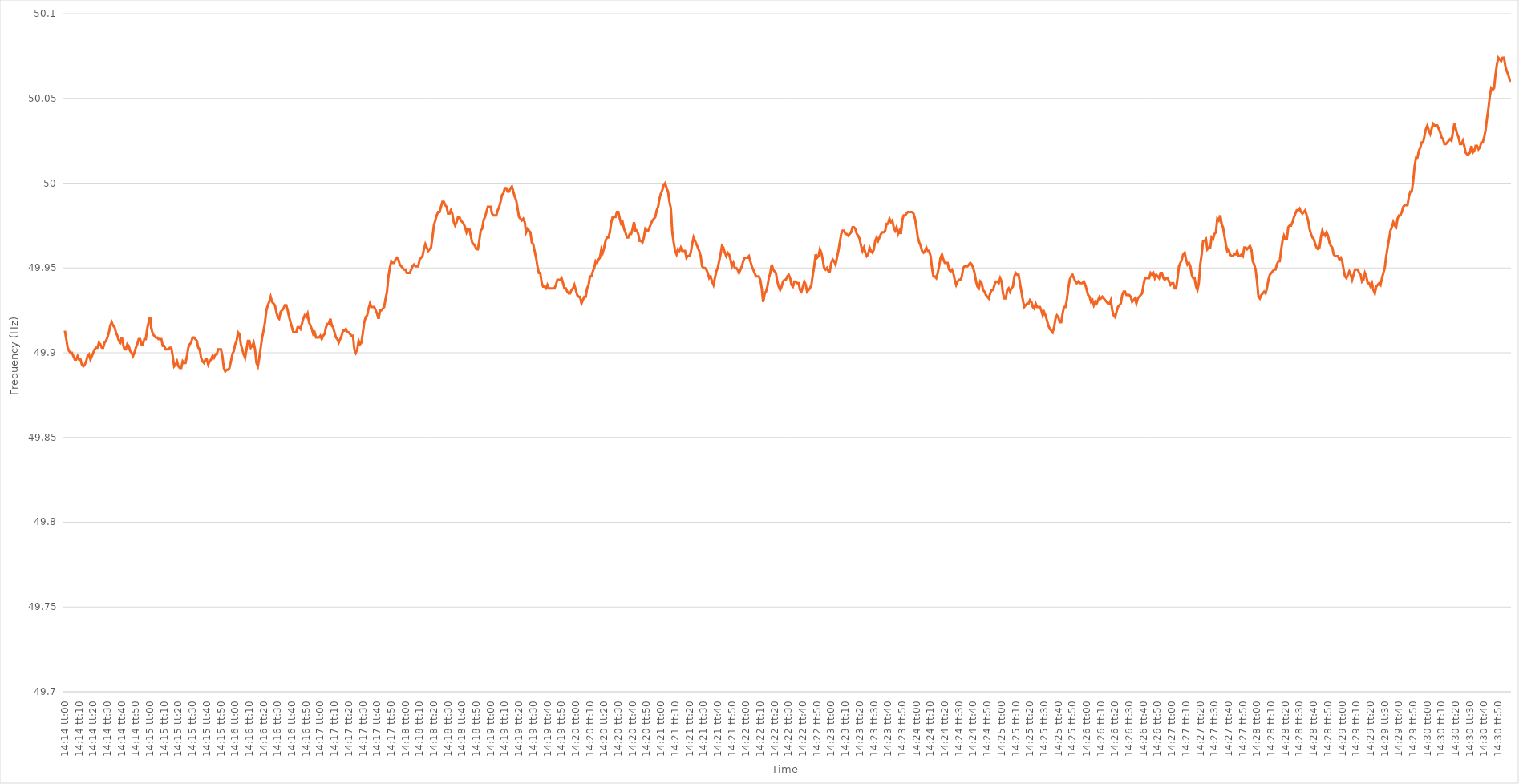
| Category | Series 0 |
|---|---|
| 0.5930555555555556 | 49.913 |
| 0.5930671296296296 | 49.908 |
| 0.5930787037037036 | 49.903 |
| 0.5930902777777778 | 49.901 |
| 0.5931018518518518 | 49.9 |
| 0.593113425925926 | 49.9 |
| 0.593125 | 49.898 |
| 0.593136574074074 | 49.896 |
| 0.5931481481481481 | 49.896 |
| 0.5931597222222222 | 49.898 |
| 0.5931712962962963 | 49.896 |
| 0.5931828703703704 | 49.896 |
| 0.5931944444444445 | 49.893 |
| 0.5932060185185185 | 49.892 |
| 0.5932175925925925 | 49.893 |
| 0.5932291666666667 | 49.895 |
| 0.5932407407407407 | 49.898 |
| 0.5932523148148149 | 49.899 |
| 0.5932638888888889 | 49.896 |
| 0.593275462962963 | 49.898 |
| 0.593287037037037 | 49.9 |
| 0.593298611111111 | 49.902 |
| 0.5933101851851852 | 49.903 |
| 0.5933217592592592 | 49.903 |
| 0.5933333333333334 | 49.906 |
| 0.5933449074074074 | 49.905 |
| 0.5933564814814815 | 49.903 |
| 0.5933680555555555 | 49.903 |
| 0.5933796296296296 | 49.906 |
| 0.5933912037037037 | 49.907 |
| 0.5934027777777778 | 49.909 |
| 0.5934143518518519 | 49.912 |
| 0.5934259259259259 | 49.916 |
| 0.5934375 | 49.918 |
| 0.5934490740740741 | 49.916 |
| 0.5934606481481481 | 49.915 |
| 0.5934722222222223 | 49.912 |
| 0.5934837962962963 | 49.91 |
| 0.5934953703703704 | 49.907 |
| 0.5935069444444444 | 49.906 |
| 0.5935185185185184 | 49.909 |
| 0.5935300925925926 | 49.905 |
| 0.5935416666666666 | 49.902 |
| 0.5935532407407408 | 49.902 |
| 0.5935648148148148 | 49.905 |
| 0.5935763888888889 | 49.904 |
| 0.5935879629629629 | 49.901 |
| 0.593599537037037 | 49.9 |
| 0.5936111111111111 | 49.898 |
| 0.5936226851851852 | 49.9 |
| 0.5936342592592593 | 49.903 |
| 0.5936458333333333 | 49.905 |
| 0.5936574074074074 | 49.908 |
| 0.5936689814814815 | 49.908 |
| 0.5936805555555555 | 49.905 |
| 0.5936921296296297 | 49.905 |
| 0.5937037037037037 | 49.908 |
| 0.5937152777777778 | 49.908 |
| 0.5937268518518518 | 49.914 |
| 0.593738425925926 | 49.918 |
| 0.59375 | 49.921 |
| 0.593761574074074 | 49.914 |
| 0.5937731481481482 | 49.911 |
| 0.5937847222222222 | 49.91 |
| 0.5937962962962963 | 49.909 |
| 0.5938078703703703 | 49.909 |
| 0.5938194444444445 | 49.908 |
| 0.5938310185185185 | 49.908 |
| 0.5938425925925926 | 49.908 |
| 0.5938541666666667 | 49.904 |
| 0.5938657407407407 | 49.904 |
| 0.5938773148148148 | 49.902 |
| 0.5938888888888889 | 49.902 |
| 0.593900462962963 | 49.902 |
| 0.5939120370370371 | 49.903 |
| 0.5939236111111111 | 49.903 |
| 0.5939351851851852 | 49.898 |
| 0.5939467592592592 | 49.892 |
| 0.5939583333333334 | 49.893 |
| 0.5939699074074074 | 49.895 |
| 0.5939814814814816 | 49.892 |
| 0.5939930555555556 | 49.891 |
| 0.5940046296296296 | 49.891 |
| 0.5940162037037037 | 49.895 |
| 0.5940277777777777 | 49.894 |
| 0.5940393518518519 | 49.894 |
| 0.5940509259259259 | 49.898 |
| 0.5940625 | 49.903 |
| 0.5940740740740741 | 49.905 |
| 0.5940856481481481 | 49.906 |
| 0.5940972222222222 | 49.909 |
| 0.5941087962962963 | 49.909 |
| 0.5941203703703704 | 49.908 |
| 0.5941319444444445 | 49.907 |
| 0.5941435185185185 | 49.903 |
| 0.5941550925925926 | 49.902 |
| 0.5941666666666666 | 49.897 |
| 0.5941782407407408 | 49.895 |
| 0.5941898148148148 | 49.894 |
| 0.594201388888889 | 49.896 |
| 0.594212962962963 | 49.896 |
| 0.594224537037037 | 49.893 |
| 0.5942361111111111 | 49.895 |
| 0.5942476851851851 | 49.896 |
| 0.5942592592592593 | 49.898 |
| 0.5942708333333333 | 49.897 |
| 0.5942824074074075 | 49.899 |
| 0.5942939814814815 | 49.899 |
| 0.5943055555555555 | 49.902 |
| 0.5943171296296296 | 49.902 |
| 0.5943287037037037 | 49.902 |
| 0.5943402777777778 | 49.898 |
| 0.5943518518518519 | 49.891 |
| 0.594363425925926 | 49.889 |
| 0.594375 | 49.89 |
| 0.594386574074074 | 49.89 |
| 0.5943981481481482 | 49.891 |
| 0.5944097222222222 | 49.895 |
| 0.5944212962962964 | 49.899 |
| 0.5944328703703704 | 49.901 |
| 0.5944444444444444 | 49.905 |
| 0.5944560185185185 | 49.907 |
| 0.5944675925925926 | 49.912 |
| 0.5944791666666667 | 49.911 |
| 0.5944907407407407 | 49.905 |
| 0.5945023148148149 | 49.902 |
| 0.5945138888888889 | 49.899 |
| 0.5945254629629629 | 49.897 |
| 0.594537037037037 | 49.902 |
| 0.5945486111111111 | 49.907 |
| 0.5945601851851852 | 49.907 |
| 0.5945717592592593 | 49.903 |
| 0.5945833333333334 | 49.904 |
| 0.5945949074074074 | 49.906 |
| 0.5946064814814814 | 49.902 |
| 0.5946180555555556 | 49.894 |
| 0.5946296296296296 | 49.892 |
| 0.5946412037037038 | 49.897 |
| 0.5946527777777778 | 49.903 |
| 0.5946643518518518 | 49.909 |
| 0.5946759259259259 | 49.913 |
| 0.5946875 | 49.918 |
| 0.5946990740740741 | 49.925 |
| 0.5947106481481481 | 49.928 |
| 0.5947222222222223 | 49.93 |
| 0.5947337962962963 | 49.933 |
| 0.5947453703703703 | 49.93 |
| 0.5947569444444444 | 49.929 |
| 0.5947685185185185 | 49.928 |
| 0.5947800925925926 | 49.924 |
| 0.5947916666666667 | 49.921 |
| 0.5948032407407408 | 49.92 |
| 0.5948148148148148 | 49.924 |
| 0.5948263888888888 | 49.925 |
| 0.594837962962963 | 49.926 |
| 0.594849537037037 | 49.928 |
| 0.5948611111111112 | 49.928 |
| 0.5948726851851852 | 49.925 |
| 0.5948842592592593 | 49.921 |
| 0.5948958333333333 | 49.918 |
| 0.5949074074074074 | 49.915 |
| 0.5949189814814815 | 49.912 |
| 0.5949305555555555 | 49.912 |
| 0.5949421296296297 | 49.912 |
| 0.5949537037037037 | 49.915 |
| 0.5949652777777777 | 49.915 |
| 0.5949768518518518 | 49.914 |
| 0.5949884259259259 | 49.917 |
| 0.595 | 49.92 |
| 0.5950115740740741 | 49.922 |
| 0.5950231481481482 | 49.921 |
| 0.5950347222222222 | 49.923 |
| 0.5950462962962962 | 49.918 |
| 0.5950578703703704 | 49.916 |
| 0.5950694444444444 | 49.914 |
| 0.5950810185185186 | 49.911 |
| 0.5950925925925926 | 49.912 |
| 0.5951041666666667 | 49.909 |
| 0.5951157407407407 | 49.909 |
| 0.5951273148148148 | 49.909 |
| 0.5951388888888889 | 49.91 |
| 0.595150462962963 | 49.908 |
| 0.5951620370370371 | 49.91 |
| 0.5951736111111111 | 49.911 |
| 0.5951851851851852 | 49.915 |
| 0.5951967592592592 | 49.917 |
| 0.5952083333333333 | 49.917 |
| 0.5952199074074074 | 49.92 |
| 0.5952314814814815 | 49.916 |
| 0.5952430555555556 | 49.915 |
| 0.5952546296296296 | 49.912 |
| 0.5952662037037036 | 49.909 |
| 0.5952777777777778 | 49.908 |
| 0.5952893518518518 | 49.906 |
| 0.595300925925926 | 49.908 |
| 0.5953125 | 49.91 |
| 0.5953240740740741 | 49.913 |
| 0.5953356481481481 | 49.913 |
| 0.5953472222222222 | 49.914 |
| 0.5953587962962963 | 49.912 |
| 0.5953703703703704 | 49.912 |
| 0.5953819444444445 | 49.911 |
| 0.5953935185185185 | 49.91 |
| 0.5954050925925926 | 49.91 |
| 0.5954166666666666 | 49.902 |
| 0.5954282407407407 | 49.9 |
| 0.5954398148148148 | 49.902 |
| 0.5954513888888889 | 49.907 |
| 0.595462962962963 | 49.905 |
| 0.595474537037037 | 49.906 |
| 0.595486111111111 | 49.912 |
| 0.5954976851851852 | 49.918 |
| 0.5955092592592592 | 49.921 |
| 0.5955208333333334 | 49.922 |
| 0.5955324074074074 | 49.926 |
| 0.5955439814814815 | 49.929 |
| 0.5955555555555555 | 49.927 |
| 0.5955671296296297 | 49.927 |
| 0.5955787037037037 | 49.927 |
| 0.5955902777777778 | 49.925 |
| 0.5956018518518519 | 49.923 |
| 0.5956134259259259 | 49.92 |
| 0.595625 | 49.925 |
| 0.595636574074074 | 49.925 |
| 0.5956481481481481 | 49.926 |
| 0.5956597222222222 | 49.927 |
| 0.5956712962962963 | 49.932 |
| 0.5956828703703704 | 49.936 |
| 0.5956944444444444 | 49.945 |
| 0.5957060185185185 | 49.95 |
| 0.5957175925925926 | 49.954 |
| 0.5957291666666666 | 49.953 |
| 0.5957407407407408 | 49.953 |
| 0.5957523148148148 | 49.955 |
| 0.5957638888888889 | 49.956 |
| 0.5957754629629629 | 49.955 |
| 0.5957870370370371 | 49.952 |
| 0.5957986111111111 | 49.951 |
| 0.5958101851851852 | 49.95 |
| 0.5958217592592593 | 49.949 |
| 0.5958333333333333 | 49.949 |
| 0.5958449074074074 | 49.947 |
| 0.5958564814814815 | 49.947 |
| 0.5958680555555556 | 49.947 |
| 0.5958796296296297 | 49.949 |
| 0.5958912037037037 | 49.951 |
| 0.5959027777777778 | 49.952 |
| 0.5959143518518518 | 49.951 |
| 0.5959259259259259 | 49.951 |
| 0.5959375 | 49.951 |
| 0.595949074074074 | 49.955 |
| 0.5959606481481482 | 49.956 |
| 0.5959722222222222 | 49.957 |
| 0.5959837962962963 | 49.961 |
| 0.5959953703703703 | 49.964 |
| 0.5960069444444445 | 49.962 |
| 0.5960185185185185 | 49.96 |
| 0.5960300925925927 | 49.961 |
| 0.5960416666666667 | 49.962 |
| 0.5960532407407407 | 49.968 |
| 0.5960648148148148 | 49.975 |
| 0.5960763888888889 | 49.978 |
| 0.596087962962963 | 49.981 |
| 0.5960995370370371 | 49.983 |
| 0.5961111111111111 | 49.983 |
| 0.5961226851851852 | 49.986 |
| 0.5961342592592592 | 49.989 |
| 0.5961458333333333 | 49.989 |
| 0.5961574074074074 | 49.987 |
| 0.5961689814814815 | 49.986 |
| 0.5961805555555556 | 49.982 |
| 0.5961921296296296 | 49.982 |
| 0.5962037037037037 | 49.984 |
| 0.5962152777777777 | 49.982 |
| 0.5962268518518519 | 49.977 |
| 0.5962384259259259 | 49.975 |
| 0.5962500000000001 | 49.977 |
| 0.5962615740740741 | 49.98 |
| 0.5962731481481481 | 49.98 |
| 0.5962847222222222 | 49.978 |
| 0.5962962962962963 | 49.977 |
| 0.5963078703703704 | 49.976 |
| 0.5963194444444445 | 49.974 |
| 0.5963310185185186 | 49.971 |
| 0.5963425925925926 | 49.973 |
| 0.5963541666666666 | 49.973 |
| 0.5963657407407407 | 49.969 |
| 0.5963773148148148 | 49.965 |
| 0.5963888888888889 | 49.964 |
| 0.596400462962963 | 49.963 |
| 0.596412037037037 | 49.961 |
| 0.5964236111111111 | 49.961 |
| 0.5964351851851851 | 49.966 |
| 0.5964467592592593 | 49.972 |
| 0.5964583333333333 | 49.973 |
| 0.5964699074074075 | 49.978 |
| 0.5964814814814815 | 49.98 |
| 0.5964930555555555 | 49.983 |
| 0.5965046296296296 | 49.986 |
| 0.5965162037037037 | 49.986 |
| 0.5965277777777778 | 49.986 |
| 0.5965393518518519 | 49.982 |
| 0.596550925925926 | 49.981 |
| 0.5965625 | 49.981 |
| 0.596574074074074 | 49.981 |
| 0.5965856481481482 | 49.984 |
| 0.5965972222222222 | 49.986 |
| 0.5966087962962963 | 49.989 |
| 0.5966203703703704 | 49.993 |
| 0.5966319444444445 | 49.994 |
| 0.5966435185185185 | 49.997 |
| 0.5966550925925925 | 49.997 |
| 0.5966666666666667 | 49.995 |
| 0.5966782407407407 | 49.995 |
| 0.5966898148148149 | 49.997 |
| 0.5967013888888889 | 49.998 |
| 0.596712962962963 | 49.995 |
| 0.596724537037037 | 49.992 |
| 0.5967361111111111 | 49.99 |
| 0.5967476851851852 | 49.985 |
| 0.5967592592592593 | 49.98 |
| 0.5967708333333334 | 49.979 |
| 0.5967824074074074 | 49.978 |
| 0.5967939814814814 | 49.979 |
| 0.5968055555555556 | 49.977 |
| 0.5968171296296296 | 49.971 |
| 0.5968287037037037 | 49.973 |
| 0.5968402777777778 | 49.972 |
| 0.5968518518518519 | 49.971 |
| 0.5968634259259259 | 49.965 |
| 0.5968749999999999 | 49.964 |
| 0.5968865740740741 | 49.96 |
| 0.5968981481481481 | 49.956 |
| 0.5969097222222223 | 49.951 |
| 0.5969212962962963 | 49.947 |
| 0.5969328703703703 | 49.947 |
| 0.5969444444444444 | 49.941 |
| 0.5969560185185185 | 49.939 |
| 0.5969675925925926 | 49.939 |
| 0.5969791666666667 | 49.938 |
| 0.5969907407407408 | 49.94 |
| 0.5970023148148148 | 49.938 |
| 0.5970138888888888 | 49.938 |
| 0.597025462962963 | 49.938 |
| 0.597037037037037 | 49.938 |
| 0.5970486111111112 | 49.938 |
| 0.5970601851851852 | 49.94 |
| 0.5970717592592593 | 49.943 |
| 0.5970833333333333 | 49.943 |
| 0.5970949074074073 | 49.943 |
| 0.5971064814814815 | 49.944 |
| 0.5971180555555555 | 49.941 |
| 0.5971296296296297 | 49.938 |
| 0.5971412037037037 | 49.938 |
| 0.5971527777777778 | 49.936 |
| 0.5971643518518518 | 49.935 |
| 0.5971759259259259 | 49.935 |
| 0.5971875 | 49.937 |
| 0.5971990740740741 | 49.938 |
| 0.5972106481481482 | 49.94 |
| 0.5972222222222222 | 49.937 |
| 0.5972337962962962 | 49.934 |
| 0.5972453703703704 | 49.933 |
| 0.5972569444444444 | 49.933 |
| 0.5972685185185186 | 49.929 |
| 0.5972800925925926 | 49.931 |
| 0.5972916666666667 | 49.933 |
| 0.5973032407407407 | 49.933 |
| 0.5973148148148147 | 49.938 |
| 0.5973263888888889 | 49.94 |
| 0.5973379629629629 | 49.945 |
| 0.5973495370370371 | 49.945 |
| 0.5973611111111111 | 49.948 |
| 0.5973726851851852 | 49.95 |
| 0.5973842592592592 | 49.954 |
| 0.5973958333333333 | 49.953 |
| 0.5974074074074074 | 49.955 |
| 0.5974189814814815 | 49.956 |
| 0.5974305555555556 | 49.961 |
| 0.5974421296296296 | 49.959 |
| 0.5974537037037037 | 49.962 |
| 0.5974652777777778 | 49.966 |
| 0.5974768518518518 | 49.968 |
| 0.597488425925926 | 49.968 |
| 0.5975 | 49.971 |
| 0.5975115740740741 | 49.977 |
| 0.5975231481481481 | 49.98 |
| 0.5975347222222221 | 49.98 |
| 0.5975462962962963 | 49.98 |
| 0.5975578703703703 | 49.983 |
| 0.5975694444444445 | 49.983 |
| 0.5975810185185185 | 49.979 |
| 0.5975925925925926 | 49.976 |
| 0.5976041666666666 | 49.977 |
| 0.5976157407407408 | 49.973 |
| 0.5976273148148148 | 49.971 |
| 0.5976388888888889 | 49.968 |
| 0.597650462962963 | 49.968 |
| 0.597662037037037 | 49.97 |
| 0.5976736111111111 | 49.97 |
| 0.5976851851851852 | 49.973 |
| 0.5976967592592592 | 49.977 |
| 0.5977083333333334 | 49.972 |
| 0.5977199074074074 | 49.972 |
| 0.5977314814814815 | 49.97 |
| 0.5977430555555555 | 49.966 |
| 0.5977546296296297 | 49.966 |
| 0.5977662037037037 | 49.965 |
| 0.5977777777777779 | 49.968 |
| 0.5977893518518519 | 49.973 |
| 0.5978009259259259 | 49.972 |
| 0.5978125 | 49.972 |
| 0.597824074074074 | 49.974 |
| 0.5978356481481482 | 49.976 |
| 0.5978472222222222 | 49.978 |
| 0.5978587962962963 | 49.979 |
| 0.5978703703703704 | 49.98 |
| 0.5978819444444444 | 49.984 |
| 0.5978935185185185 | 49.986 |
| 0.5979050925925926 | 49.991 |
| 0.5979166666666667 | 49.994 |
| 0.5979282407407408 | 49.996 |
| 0.5979398148148148 | 49.999 |
| 0.5979513888888889 | 50 |
| 0.5979629629629629 | 49.997 |
| 0.5979745370370371 | 49.995 |
| 0.5979861111111111 | 49.989 |
| 0.5979976851851853 | 49.985 |
| 0.5980092592592593 | 49.971 |
| 0.5980208333333333 | 49.965 |
| 0.5980324074074074 | 49.96 |
| 0.5980439814814814 | 49.958 |
| 0.5980555555555556 | 49.961 |
| 0.5980671296296296 | 49.96 |
| 0.5980787037037038 | 49.962 |
| 0.5980902777777778 | 49.96 |
| 0.5981018518518518 | 49.96 |
| 0.5981134259259259 | 49.96 |
| 0.598125 | 49.956 |
| 0.5981365740740741 | 49.957 |
| 0.5981481481481482 | 49.957 |
| 0.5981597222222222 | 49.959 |
| 0.5981712962962963 | 49.964 |
| 0.5981828703703703 | 49.968 |
| 0.5981944444444445 | 49.966 |
| 0.5982060185185185 | 49.964 |
| 0.5982175925925927 | 49.962 |
| 0.5982291666666667 | 49.96 |
| 0.5982407407407407 | 49.957 |
| 0.5982523148148148 | 49.951 |
| 0.5982638888888888 | 49.95 |
| 0.598275462962963 | 49.95 |
| 0.598287037037037 | 49.949 |
| 0.5982986111111112 | 49.947 |
| 0.5983101851851852 | 49.944 |
| 0.5983217592592592 | 49.945 |
| 0.5983333333333333 | 49.942 |
| 0.5983449074074074 | 49.94 |
| 0.5983564814814815 | 49.944 |
| 0.5983680555555556 | 49.948 |
| 0.5983796296296297 | 49.95 |
| 0.5983912037037037 | 49.954 |
| 0.5984027777777777 | 49.958 |
| 0.5984143518518519 | 49.963 |
| 0.5984259259259259 | 49.962 |
| 0.5984375000000001 | 49.959 |
| 0.5984490740740741 | 49.957 |
| 0.5984606481481481 | 49.959 |
| 0.5984722222222222 | 49.958 |
| 0.5984837962962963 | 49.955 |
| 0.5984953703703704 | 49.951 |
| 0.5985069444444444 | 49.953 |
| 0.5985185185185186 | 49.95 |
| 0.5985300925925926 | 49.95 |
| 0.5985416666666666 | 49.949 |
| 0.5985532407407407 | 49.947 |
| 0.5985648148148148 | 49.949 |
| 0.5985763888888889 | 49.951 |
| 0.598587962962963 | 49.954 |
| 0.598599537037037 | 49.956 |
| 0.5986111111111111 | 49.956 |
| 0.5986226851851851 | 49.956 |
| 0.5986342592592593 | 49.957 |
| 0.5986458333333333 | 49.954 |
| 0.5986574074074075 | 49.951 |
| 0.5986689814814815 | 49.949 |
| 0.5986805555555555 | 49.947 |
| 0.5986921296296296 | 49.945 |
| 0.5987037037037037 | 49.945 |
| 0.5987152777777778 | 49.945 |
| 0.5987268518518518 | 49.943 |
| 0.598738425925926 | 49.938 |
| 0.59875 | 49.93 |
| 0.598761574074074 | 49.935 |
| 0.5987731481481481 | 49.936 |
| 0.5987847222222222 | 49.939 |
| 0.5987962962962963 | 49.944 |
| 0.5988078703703704 | 49.947 |
| 0.5988194444444445 | 49.952 |
| 0.5988310185185185 | 49.949 |
| 0.5988425925925925 | 49.948 |
| 0.5988541666666667 | 49.947 |
| 0.5988657407407407 | 49.942 |
| 0.5988773148148149 | 49.939 |
| 0.5988888888888889 | 49.937 |
| 0.598900462962963 | 49.939 |
| 0.598912037037037 | 49.942 |
| 0.5989236111111111 | 49.943 |
| 0.5989351851851852 | 49.943 |
| 0.5989467592592593 | 49.945 |
| 0.5989583333333334 | 49.946 |
| 0.5989699074074074 | 49.944 |
| 0.5989814814814814 | 49.94 |
| 0.5989930555555555 | 49.939 |
| 0.5990046296296296 | 49.942 |
| 0.5990162037037037 | 49.942 |
| 0.5990277777777778 | 49.941 |
| 0.5990393518518519 | 49.941 |
| 0.5990509259259259 | 49.937 |
| 0.5990624999999999 | 49.936 |
| 0.5990740740740741 | 49.939 |
| 0.5990856481481481 | 49.942 |
| 0.5990972222222223 | 49.94 |
| 0.5991087962962963 | 49.936 |
| 0.5991203703703704 | 49.937 |
| 0.5991319444444444 | 49.938 |
| 0.5991435185185185 | 49.94 |
| 0.5991550925925926 | 49.946 |
| 0.5991666666666667 | 49.951 |
| 0.5991782407407408 | 49.958 |
| 0.5991898148148148 | 49.956 |
| 0.5992013888888889 | 49.957 |
| 0.5992129629629629 | 49.961 |
| 0.599224537037037 | 49.959 |
| 0.5992361111111111 | 49.955 |
| 0.5992476851851852 | 49.95 |
| 0.5992592592592593 | 49.949 |
| 0.5992708333333333 | 49.95 |
| 0.5992824074074073 | 49.948 |
| 0.5992939814814815 | 49.948 |
| 0.5993055555555555 | 49.953 |
| 0.5993171296296297 | 49.955 |
| 0.5993287037037037 | 49.954 |
| 0.5993402777777778 | 49.952 |
| 0.5993518518518518 | 49.956 |
| 0.599363425925926 | 49.96 |
| 0.599375 | 49.965 |
| 0.5993865740740741 | 49.97 |
| 0.5993981481481482 | 49.972 |
| 0.5994097222222222 | 49.972 |
| 0.5994212962962963 | 49.97 |
| 0.5994328703703703 | 49.97 |
| 0.5994444444444444 | 49.969 |
| 0.5994560185185185 | 49.97 |
| 0.5994675925925926 | 49.971 |
| 0.5994791666666667 | 49.974 |
| 0.5994907407407407 | 49.974 |
| 0.5995023148148148 | 49.973 |
| 0.5995138888888889 | 49.97 |
| 0.5995254629629629 | 49.969 |
| 0.5995370370370371 | 49.967 |
| 0.5995486111111111 | 49.963 |
| 0.5995601851851852 | 49.96 |
| 0.5995717592592592 | 49.962 |
| 0.5995833333333334 | 49.959 |
| 0.5995949074074074 | 49.957 |
| 0.5996064814814815 | 49.958 |
| 0.5996180555555556 | 49.962 |
| 0.5996296296296296 | 49.96 |
| 0.5996412037037037 | 49.959 |
| 0.5996527777777778 | 49.961 |
| 0.5996643518518519 | 49.966 |
| 0.599675925925926 | 49.968 |
| 0.5996875 | 49.966 |
| 0.5996990740740741 | 49.968 |
| 0.5997106481481481 | 49.97 |
| 0.5997222222222222 | 49.971 |
| 0.5997337962962963 | 49.971 |
| 0.5997453703703703 | 49.972 |
| 0.5997569444444445 | 49.976 |
| 0.5997685185185185 | 49.976 |
| 0.5997800925925926 | 49.979 |
| 0.5997916666666666 | 49.977 |
| 0.5998032407407408 | 49.978 |
| 0.5998148148148148 | 49.974 |
| 0.599826388888889 | 49.972 |
| 0.599837962962963 | 49.974 |
| 0.599849537037037 | 49.97 |
| 0.5998611111111111 | 49.972 |
| 0.5998726851851852 | 49.97 |
| 0.5998842592592593 | 49.978 |
| 0.5998958333333334 | 49.981 |
| 0.5999074074074074 | 49.981 |
| 0.5999189814814815 | 49.982 |
| 0.5999305555555555 | 49.983 |
| 0.5999421296296296 | 49.983 |
| 0.5999537037037037 | 49.983 |
| 0.5999652777777778 | 49.983 |
| 0.5999768518518519 | 49.982 |
| 0.5999884259259259 | 49.979 |
| 0.6 | 49.974 |
| 0.600011574074074 | 49.968 |
| 0.6000231481481482 | 49.965 |
| 0.6000347222222222 | 49.963 |
| 0.6000462962962964 | 49.96 |
| 0.6000578703703704 | 49.959 |
| 0.6000694444444444 | 49.96 |
| 0.6000810185185185 | 49.962 |
| 0.6000925925925926 | 49.96 |
| 0.6001041666666667 | 49.96 |
| 0.6001157407407408 | 49.957 |
| 0.6001273148148148 | 49.95 |
| 0.6001388888888889 | 49.945 |
| 0.6001504629629629 | 49.945 |
| 0.600162037037037 | 49.944 |
| 0.6001736111111111 | 49.947 |
| 0.6001851851851852 | 49.951 |
| 0.6001967592592593 | 49.956 |
| 0.6002083333333333 | 49.958 |
| 0.6002199074074074 | 49.955 |
| 0.6002314814814814 | 49.953 |
| 0.6002430555555556 | 49.953 |
| 0.6002546296296296 | 49.953 |
| 0.6002662037037038 | 49.949 |
| 0.6002777777777778 | 49.948 |
| 0.6002893518518518 | 49.949 |
| 0.6003009259259259 | 49.947 |
| 0.6003125 | 49.943 |
| 0.6003240740740741 | 49.94 |
| 0.6003356481481482 | 49.942 |
| 0.6003472222222223 | 49.943 |
| 0.6003587962962963 | 49.943 |
| 0.6003703703703703 | 49.945 |
| 0.6003819444444445 | 49.95 |
| 0.6003935185185185 | 49.951 |
| 0.6004050925925926 | 49.951 |
| 0.6004166666666667 | 49.951 |
| 0.6004282407407407 | 49.952 |
| 0.6004398148148148 | 49.953 |
| 0.6004513888888888 | 49.952 |
| 0.600462962962963 | 49.95 |
| 0.600474537037037 | 49.947 |
| 0.6004861111111112 | 49.942 |
| 0.6004976851851852 | 49.939 |
| 0.6005092592592592 | 49.938 |
| 0.6005208333333333 | 49.942 |
| 0.6005324074074074 | 49.941 |
| 0.6005439814814815 | 49.937 |
| 0.6005555555555556 | 49.936 |
| 0.6005671296296297 | 49.934 |
| 0.6005787037037037 | 49.933 |
| 0.6005902777777777 | 49.932 |
| 0.6006018518518519 | 49.935 |
| 0.6006134259259259 | 49.937 |
| 0.600625 | 49.937 |
| 0.6006365740740741 | 49.94 |
| 0.6006481481481482 | 49.942 |
| 0.6006597222222222 | 49.942 |
| 0.6006712962962962 | 49.941 |
| 0.6006828703703704 | 49.944 |
| 0.6006944444444444 | 49.942 |
| 0.6007060185185186 | 49.935 |
| 0.6007175925925926 | 49.932 |
| 0.6007291666666666 | 49.932 |
| 0.6007407407407407 | 49.937 |
| 0.6007523148148148 | 49.938 |
| 0.6007638888888889 | 49.936 |
| 0.600775462962963 | 49.938 |
| 0.6007870370370371 | 49.939 |
| 0.6007986111111111 | 49.945 |
| 0.6008101851851851 | 49.947 |
| 0.6008217592592593 | 49.946 |
| 0.6008333333333333 | 49.946 |
| 0.6008449074074074 | 49.941 |
| 0.6008564814814815 | 49.936 |
| 0.6008680555555556 | 49.931 |
| 0.6008796296296296 | 49.927 |
| 0.6008912037037036 | 49.928 |
| 0.6009027777777778 | 49.929 |
| 0.6009143518518518 | 49.929 |
| 0.600925925925926 | 49.931 |
| 0.6009375 | 49.93 |
| 0.600949074074074 | 49.927 |
| 0.6009606481481481 | 49.926 |
| 0.6009722222222222 | 49.929 |
| 0.6009837962962963 | 49.927 |
| 0.6009953703703704 | 49.927 |
| 0.6010069444444445 | 49.927 |
| 0.6010185185185185 | 49.925 |
| 0.6010300925925925 | 49.922 |
| 0.6010416666666667 | 49.924 |
| 0.6010532407407407 | 49.922 |
| 0.6010648148148149 | 49.919 |
| 0.6010763888888889 | 49.916 |
| 0.601087962962963 | 49.914 |
| 0.601099537037037 | 49.913 |
| 0.601111111111111 | 49.912 |
| 0.6011226851851852 | 49.915 |
| 0.6011342592592592 | 49.92 |
| 0.6011458333333334 | 49.922 |
| 0.6011574074074074 | 49.921 |
| 0.6011689814814815 | 49.918 |
| 0.6011805555555555 | 49.918 |
| 0.6011921296296296 | 49.923 |
| 0.6012037037037037 | 49.927 |
| 0.6012152777777778 | 49.927 |
| 0.6012268518518519 | 49.931 |
| 0.6012384259259259 | 49.938 |
| 0.60125 | 49.943 |
| 0.6012615740740741 | 49.945 |
| 0.6012731481481481 | 49.946 |
| 0.6012847222222223 | 49.944 |
| 0.6012962962962963 | 49.942 |
| 0.6013078703703704 | 49.941 |
| 0.6013194444444444 | 49.942 |
| 0.6013310185185184 | 49.941 |
| 0.6013425925925926 | 49.941 |
| 0.6013541666666666 | 49.941 |
| 0.6013657407407408 | 49.942 |
| 0.6013773148148148 | 49.94 |
| 0.6013888888888889 | 49.937 |
| 0.6014004629629629 | 49.934 |
| 0.601412037037037 | 49.933 |
| 0.6014236111111111 | 49.93 |
| 0.6014351851851852 | 49.931 |
| 0.6014467592592593 | 49.928 |
| 0.6014583333333333 | 49.93 |
| 0.6014699074074074 | 49.929 |
| 0.6014814814814815 | 49.931 |
| 0.6014930555555555 | 49.933 |
| 0.6015046296296297 | 49.932 |
| 0.6015162037037037 | 49.933 |
| 0.6015277777777778 | 49.932 |
| 0.6015393518518518 | 49.931 |
| 0.601550925925926 | 49.93 |
| 0.6015625 | 49.929 |
| 0.601574074074074 | 49.929 |
| 0.6015856481481482 | 49.931 |
| 0.6015972222222222 | 49.925 |
| 0.6016087962962963 | 49.922 |
| 0.6016203703703703 | 49.921 |
| 0.6016319444444445 | 49.924 |
| 0.6016435185185185 | 49.927 |
| 0.6016550925925926 | 49.928 |
| 0.6016666666666667 | 49.929 |
| 0.6016782407407407 | 49.934 |
| 0.6016898148148148 | 49.936 |
| 0.6017013888888889 | 49.936 |
| 0.601712962962963 | 49.934 |
| 0.6017245370370371 | 49.934 |
| 0.6017361111111111 | 49.934 |
| 0.6017476851851852 | 49.933 |
| 0.6017592592592592 | 49.93 |
| 0.6017708333333334 | 49.931 |
| 0.6017824074074074 | 49.932 |
| 0.6017939814814816 | 49.929 |
| 0.6018055555555556 | 49.932 |
| 0.6018171296296296 | 49.933 |
| 0.6018287037037037 | 49.934 |
| 0.6018402777777777 | 49.935 |
| 0.6018518518518519 | 49.94 |
| 0.6018634259259259 | 49.944 |
| 0.601875 | 49.944 |
| 0.6018865740740741 | 49.944 |
| 0.6018981481481481 | 49.944 |
| 0.6019097222222222 | 49.947 |
| 0.6019212962962963 | 49.946 |
| 0.6019328703703704 | 49.947 |
| 0.6019444444444445 | 49.944 |
| 0.6019560185185185 | 49.946 |
| 0.6019675925925926 | 49.945 |
| 0.6019791666666666 | 49.944 |
| 0.6019907407407408 | 49.947 |
| 0.6020023148148148 | 49.947 |
| 0.602013888888889 | 49.944 |
| 0.602025462962963 | 49.943 |
| 0.602037037037037 | 49.944 |
| 0.6020486111111111 | 49.944 |
| 0.6020601851851851 | 49.942 |
| 0.6020717592592593 | 49.94 |
| 0.6020833333333333 | 49.941 |
| 0.6020949074074075 | 49.941 |
| 0.6021064814814815 | 49.938 |
| 0.6021180555555555 | 49.938 |
| 0.6021296296296296 | 49.944 |
| 0.6021412037037037 | 49.951 |
| 0.6021527777777778 | 49.953 |
| 0.6021643518518519 | 49.955 |
| 0.602175925925926 | 49.958 |
| 0.6021875 | 49.959 |
| 0.602199074074074 | 49.955 |
| 0.6022106481481482 | 49.952 |
| 0.6022222222222222 | 49.953 |
| 0.6022337962962964 | 49.951 |
| 0.6022453703703704 | 49.946 |
| 0.6022569444444444 | 49.944 |
| 0.6022685185185185 | 49.944 |
| 0.6022800925925926 | 49.939 |
| 0.6022916666666667 | 49.937 |
| 0.6023032407407407 | 49.941 |
| 0.6023148148148149 | 49.952 |
| 0.6023263888888889 | 49.958 |
| 0.6023379629629629 | 49.966 |
| 0.602349537037037 | 49.966 |
| 0.6023611111111111 | 49.967 |
| 0.6023726851851852 | 49.961 |
| 0.6023842592592593 | 49.962 |
| 0.6023958333333334 | 49.962 |
| 0.6024074074074074 | 49.968 |
| 0.6024189814814814 | 49.967 |
| 0.6024305555555556 | 49.97 |
| 0.6024421296296296 | 49.971 |
| 0.6024537037037038 | 49.979 |
| 0.6024652777777778 | 49.978 |
| 0.6024768518518518 | 49.981 |
| 0.6024884259259259 | 49.976 |
| 0.6025 | 49.974 |
| 0.6025115740740741 | 49.969 |
| 0.6025231481481481 | 49.964 |
| 0.6025347222222223 | 49.96 |
| 0.6025462962962963 | 49.961 |
| 0.6025578703703703 | 49.958 |
| 0.6025694444444444 | 49.957 |
| 0.6025810185185185 | 49.957 |
| 0.6025925925925926 | 49.958 |
| 0.6026041666666667 | 49.958 |
| 0.6026157407407408 | 49.96 |
| 0.6026273148148148 | 49.957 |
| 0.6026388888888888 | 49.957 |
| 0.602650462962963 | 49.958 |
| 0.602662037037037 | 49.957 |
| 0.6026736111111112 | 49.962 |
| 0.6026851851851852 | 49.962 |
| 0.6026967592592593 | 49.961 |
| 0.6027083333333333 | 49.962 |
| 0.6027199074074074 | 49.963 |
| 0.6027314814814815 | 49.961 |
| 0.6027430555555555 | 49.954 |
| 0.6027546296296297 | 49.952 |
| 0.6027662037037037 | 49.949 |
| 0.6027777777777777 | 49.942 |
| 0.6027893518518518 | 49.933 |
| 0.6028009259259259 | 49.932 |
| 0.6028125 | 49.934 |
| 0.6028240740740741 | 49.935 |
| 0.6028356481481482 | 49.936 |
| 0.6028472222222222 | 49.935 |
| 0.6028587962962962 | 49.938 |
| 0.6028703703703704 | 49.943 |
| 0.6028819444444444 | 49.946 |
| 0.6028935185185186 | 49.947 |
| 0.6029050925925926 | 49.948 |
| 0.6029166666666667 | 49.949 |
| 0.6029282407407407 | 49.949 |
| 0.6029398148148148 | 49.952 |
| 0.6029513888888889 | 49.954 |
| 0.602962962962963 | 49.954 |
| 0.6029745370370371 | 49.961 |
| 0.6029861111111111 | 49.966 |
| 0.6029976851851852 | 49.969 |
| 0.6030092592592592 | 49.967 |
| 0.6030208333333333 | 49.967 |
| 0.6030324074074074 | 49.974 |
| 0.6030439814814815 | 49.975 |
| 0.6030555555555556 | 49.975 |
| 0.6030671296296296 | 49.977 |
| 0.6030787037037036 | 49.98 |
| 0.6030902777777778 | 49.982 |
| 0.6031018518518518 | 49.984 |
| 0.603113425925926 | 49.984 |
| 0.603125 | 49.985 |
| 0.6031365740740741 | 49.983 |
| 0.6031481481481481 | 49.982 |
| 0.6031597222222222 | 49.983 |
| 0.6031712962962963 | 49.984 |
| 0.6031828703703704 | 49.981 |
| 0.6031944444444445 | 49.978 |
| 0.6032060185185185 | 49.973 |
| 0.6032175925925926 | 49.97 |
| 0.6032291666666666 | 49.968 |
| 0.6032407407407407 | 49.967 |
| 0.6032523148148148 | 49.964 |
| 0.6032638888888889 | 49.962 |
| 0.603275462962963 | 49.961 |
| 0.603287037037037 | 49.962 |
| 0.603298611111111 | 49.968 |
| 0.6033101851851852 | 49.972 |
| 0.6033217592592592 | 49.97 |
| 0.6033333333333334 | 49.969 |
| 0.6033449074074074 | 49.971 |
| 0.6033564814814815 | 49.969 |
| 0.6033680555555555 | 49.965 |
| 0.6033796296296297 | 49.963 |
| 0.6033912037037037 | 49.962 |
| 0.6034027777777778 | 49.958 |
| 0.6034143518518519 | 49.957 |
| 0.6034259259259259 | 49.957 |
| 0.6034375 | 49.957 |
| 0.603449074074074 | 49.955 |
| 0.6034606481481481 | 49.956 |
| 0.6034722222222222 | 49.954 |
| 0.6034837962962963 | 49.949 |
| 0.6034953703703704 | 49.945 |
| 0.6035069444444444 | 49.944 |
| 0.6035185185185185 | 49.946 |
| 0.6035300925925926 | 49.948 |
| 0.6035416666666666 | 49.946 |
| 0.6035532407407408 | 49.943 |
| 0.6035648148148148 | 49.946 |
| 0.6035763888888889 | 49.949 |
| 0.6035879629629629 | 49.949 |
| 0.6035995370370371 | 49.949 |
| 0.6036111111111111 | 49.947 |
| 0.6036226851851852 | 49.946 |
| 0.6036342592592593 | 49.942 |
| 0.6036458333333333 | 49.943 |
| 0.6036574074074074 | 49.947 |
| 0.6036689814814815 | 49.945 |
| 0.6036805555555556 | 49.941 |
| 0.6036921296296297 | 49.941 |
| 0.6037037037037037 | 49.939 |
| 0.6037152777777778 | 49.941 |
| 0.6037268518518518 | 49.937 |
| 0.6037384259259259 | 49.935 |
| 0.60375 | 49.939 |
| 0.603761574074074 | 49.94 |
| 0.6037731481481482 | 49.941 |
| 0.6037847222222222 | 49.94 |
| 0.6037962962962963 | 49.944 |
| 0.6038078703703703 | 49.947 |
| 0.6038194444444445 | 49.95 |
| 0.6038310185185185 | 49.957 |
| 0.6038425925925927 | 49.962 |
| 0.6038541666666667 | 49.967 |
| 0.6038657407407407 | 49.972 |
| 0.6038773148148148 | 49.974 |
| 0.6038888888888889 | 49.977 |
| 0.603900462962963 | 49.975 |
| 0.6039120370370371 | 49.974 |
| 0.6039236111111111 | 49.979 |
| 0.6039351851851852 | 49.981 |
| 0.6039467592592592 | 49.981 |
| 0.6039583333333333 | 49.983 |
| 0.6039699074074074 | 49.986 |
| 0.6039814814814815 | 49.987 |
| 0.6039930555555556 | 49.987 |
| 0.6040046296296296 | 49.987 |
| 0.6040162037037037 | 49.992 |
| 0.6040277777777777 | 49.995 |
| 0.6040393518518519 | 49.995 |
| 0.6040509259259259 | 50.001 |
| 0.6040625000000001 | 50.01 |
| 0.6040740740740741 | 50.015 |
| 0.6040856481481481 | 50.015 |
| 0.6040972222222222 | 50.019 |
| 0.6041087962962963 | 50.021 |
| 0.6041203703703704 | 50.024 |
| 0.6041319444444445 | 50.024 |
| 0.6041435185185186 | 50.028 |
| 0.6041550925925926 | 50.032 |
| 0.6041666666666666 | 50.034 |
| 0.6041782407407407 | 50.031 |
| 0.6041898148148148 | 50.029 |
| 0.6042013888888889 | 50.032 |
| 0.604212962962963 | 50.035 |
| 0.604224537037037 | 50.034 |
| 0.6042361111111111 | 50.034 |
| 0.6042476851851851 | 50.034 |
| 0.6042592592592593 | 50.032 |
| 0.6042708333333333 | 50.03 |
| 0.6042824074074075 | 50.027 |
| 0.6042939814814815 | 50.026 |
| 0.6043055555555555 | 50.023 |
| 0.6043171296296296 | 50.023 |
| 0.6043287037037037 | 50.024 |
| 0.6043402777777778 | 50.025 |
| 0.6043518518518519 | 50.026 |
| 0.604363425925926 | 50.025 |
| 0.604375 | 50.03 |
| 0.604386574074074 | 50.035 |
| 0.6043981481481482 | 50.032 |
| 0.6044097222222222 | 50.029 |
| 0.6044212962962963 | 50.027 |
| 0.6044328703703704 | 50.023 |
| 0.6044444444444445 | 50.023 |
| 0.6044560185185185 | 50.025 |
| 0.6044675925925925 | 50.022 |
| 0.6044791666666667 | 50.018 |
| 0.6044907407407407 | 50.017 |
| 0.6045023148148149 | 50.017 |
| 0.6045138888888889 | 50.018 |
| 0.604525462962963 | 50.022 |
| 0.604537037037037 | 50.018 |
| 0.6045486111111111 | 50.019 |
| 0.6045601851851852 | 50.022 |
| 0.6045717592592593 | 50.022 |
| 0.6045833333333334 | 50.02 |
| 0.6045949074074074 | 50.021 |
| 0.6046064814814814 | 50.024 |
| 0.6046180555555556 | 50.024 |
| 0.6046296296296296 | 50.027 |
| 0.6046412037037037 | 50.031 |
| 0.6046527777777778 | 50.038 |
| 0.6046643518518519 | 50.044 |
| 0.6046759259259259 | 50.051 |
| 0.6046874999999999 | 50.056 |
| 0.6046990740740741 | 50.055 |
| 0.6047106481481481 | 50.056 |
| 0.6047222222222223 | 50.064 |
| 0.6047337962962963 | 50.07 |
| 0.6047453703703703 | 50.074 |
| 0.6047569444444444 | 50.073 |
| 0.6047685185185185 | 50.072 |
| 0.6047800925925926 | 50.074 |
| 0.6047916666666667 | 50.074 |
| 0.6048032407407408 | 50.069 |
| 0.6048148148148148 | 50.066 |
| 0.6048263888888888 | 50.064 |
| 0.604837962962963 | 50.061 |
| 0.604849537037037 | 50.06 |